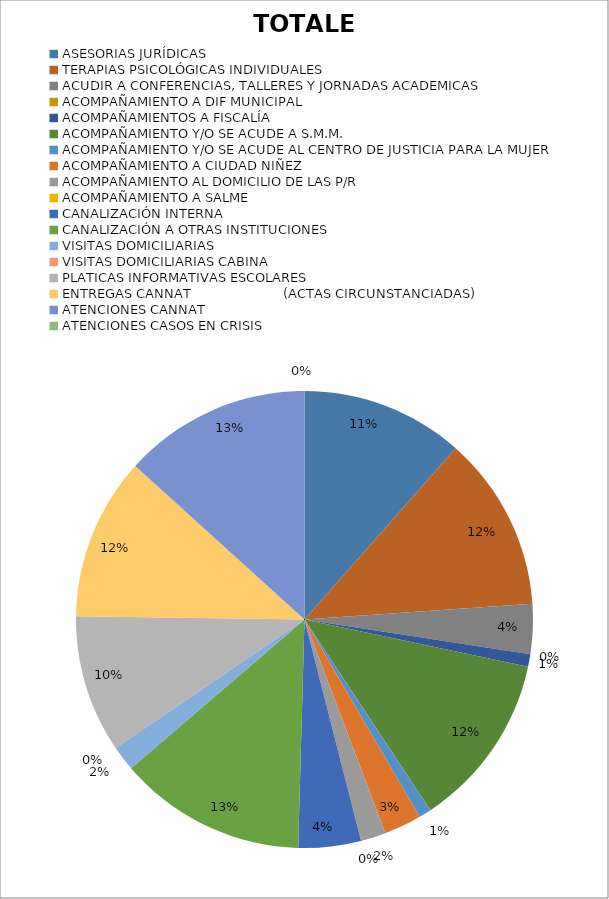
| Category | TOTALES |
|---|---|
| ASESORIAS JURÍDICAS | 13 |
| TERAPIAS PSICOLÓGICAS INDIVIDUALES | 14 |
| ACUDIR A CONFERENCIAS, TALLERES Y JORNADAS ACADEMICAS | 4 |
| ACOMPAÑAMIENTO A DIF MUNICIPAL | 0 |
| ACOMPAÑAMIENTOS A FISCALÍA | 1 |
| ACOMPAÑAMIENTO Y/O SE ACUDE A S.M.M. | 14 |
| ACOMPAÑAMIENTO Y/O SE ACUDE AL CENTRO DE JUSTICIA PARA LA MUJER | 1 |
| ACOMPAÑAMIENTO A CIUDAD NIÑEZ  | 3 |
| ACOMPAÑAMIENTO AL DOMICILIO DE LAS P/R | 2 |
| ACOMPAÑAMIENTO A SALME | 0 |
| CANALIZACIÓN INTERNA | 5 |
| CANALIZACIÓN A OTRAS INSTITUCIONES | 15 |
| VISITAS DOMICILIARIAS | 2 |
| VISITAS DOMICILIARIAS CABINA | 0 |
| PLATICAS INFORMATIVAS ESCOLARES | 11 |
| ENTREGAS CANNAT                       (ACTAS CIRCUNSTANCIADAS) | 13 |
| ATENCIONES CANNAT | 15 |
| ATENCIONES CASOS EN CRISIS | 0 |